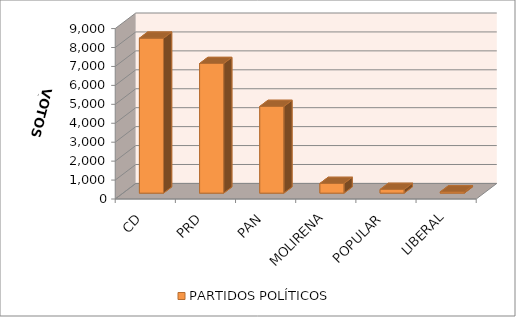
| Category | PARTIDOS POLÍTICOS |
|---|---|
| CD | 8180 |
| PRD | 6844 |
| PAN | 4577 |
| MOLIRENA | 511 |
| POPULAR | 195 |
| LIBERAL | 65 |